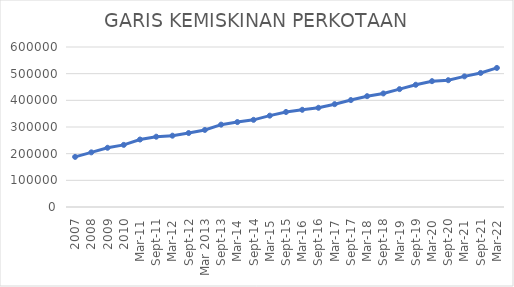
| Category | GARIS KEMISKINAN PERKOTAAN |
|---|---|
| 2007 | 187942 |
| 2008 | 204895.99 |
| 2009 | 222123.1 |
| 2010 | 232989 |
| Mar-11 | 253016 |
| Sep-11 | 263594 |
| Mar-12 | 267407.53 |
| Sep-12 | 277382 |
| Mar 2013 | 289041.91 |
| Sep-13 | 308826 |
| Mar-14 | 318514 |
| Sep-14 | 326853 |
| Mar-15 | 342541 |
| Sep-15 | 356378 |
| Mar-16 | 364526.571 |
| Sep-16 | 372114 |
| Mar-17 | 385621 |
| Sep-17 | 400995 |
| Mar-18 | 415614 |
| Sep-18 | 425770 |
| Mar-19 | 442062 |
| Sep-19 | 458380 |
| Mar-20 | 471882 |
| Sep-20 | 475477 |
| Mar-21 | 489848 |
| Sep-21 | 502730 |
| Mar-22 | 521494 |